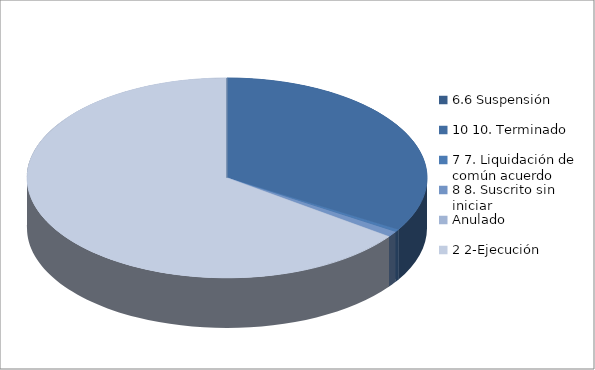
| Category | Series 0 |
|---|---|
| 6.6 Suspensión | 0 |
| 10 10. Terminado | 222 |
| 7 7. Liquidación de común acuerdo | 3 |
| 8 8. Suscrito sin iniciar | 6 |
| Anulado | 0 |
| 2 2-Ejecución | 429 |